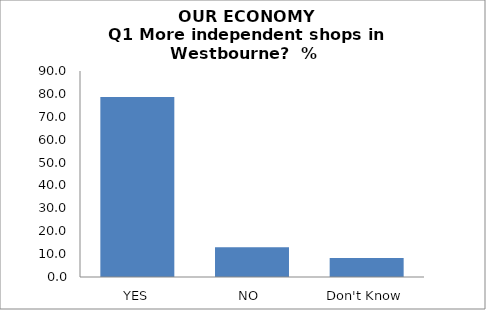
| Category | Series 0 |
|---|---|
| YES | 78.67 |
| NO  | 13.019 |
| Don't Know | 8.31 |